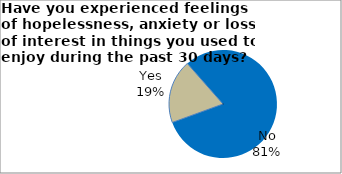
| Category | Series 0 |
|---|---|
| Yes | 19.062 |
| No | 80.938 |